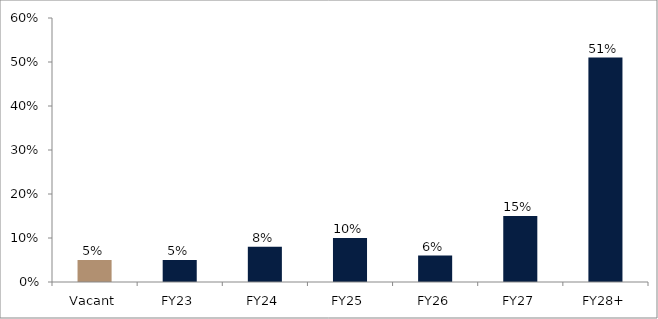
| Category | Series 0 |
|---|---|
| Vacant | 0.05 |
| FY23 | 0.05 |
| FY24 | 0.08 |
| FY25 | 0.1 |
| FY26 | 0.06 |
| FY27 | 0.15 |
| FY28+ | 0.51 |